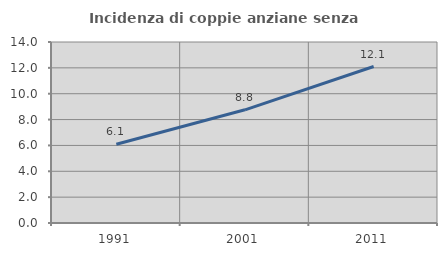
| Category | Incidenza di coppie anziane senza figli  |
|---|---|
| 1991.0 | 6.094 |
| 2001.0 | 8.755 |
| 2011.0 | 12.103 |